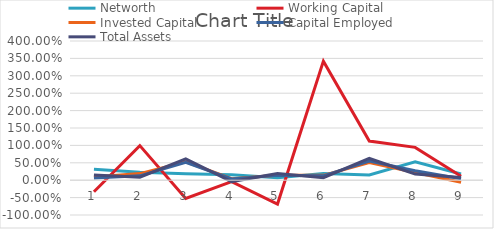
| Category | Networth | Working Capital | Invested Capital | Capital Employed | Total Assets |
|---|---|---|---|---|---|
| 0 | 0.313 | -0.331 | 0.094 | 0.064 | 0.151 |
| 1 | 0.231 | 0.994 | 0.189 | 0.125 | 0.088 |
| 2 | 0.184 | -0.525 | 0.527 | 0.513 | 0.612 |
| 3 | 0.155 | -0.039 | 0.042 | 0.037 | -0.04 |
| 4 | 0.073 | -0.684 | 0.143 | 0.142 | 0.194 |
| 5 | 0.19 | 3.421 | 0.139 | 0.126 | 0.071 |
| 6 | 0.152 | 1.126 | 0.505 | 0.551 | 0.624 |
| 7 | 0.527 | 0.943 | 0.223 | 0.273 | 0.177 |
| 8 | 0.179 | 0.116 | -0.059 | 0.043 | 0.077 |